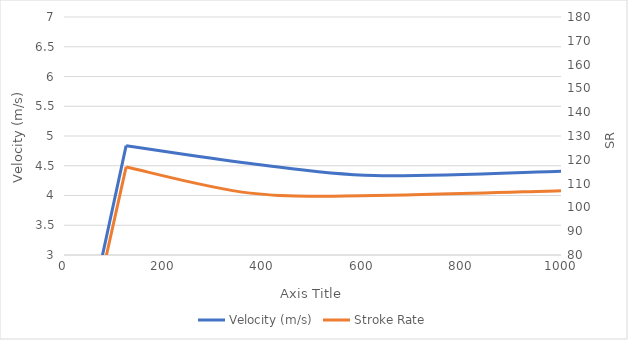
| Category | Velocity (m/s) |
|---|---|
| 0.0 | 0 |
| 125.0 | 4.837 |
| 375.0 | 4.539 |
| 625.0 | 4.335 |
| 1000.0 | 4.408 |